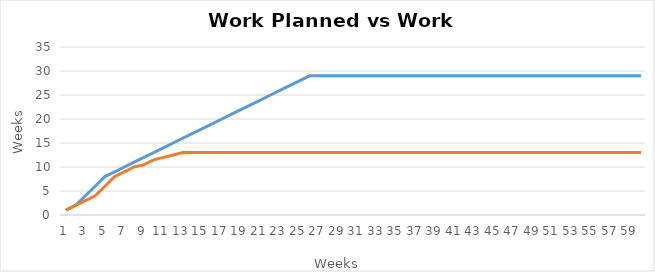
| Category | WP | WA |
|---|---|---|
| 0 | 1 | 1 |
| 1 | 2 | 2 |
| 2 | 4 | 3 |
| 3 | 6 | 4 |
| 4 | 8 | 6 |
| 5 | 9 | 8 |
| 6 | 10 | 9 |
| 7 | 11 | 10 |
| 8 | 12 | 10.5 |
| 9 | 13 | 11.5 |
| 10 | 14 | 12 |
| 11 | 15 | 12.5 |
| 12 | 16 | 13 |
| 13 | 17 | 13 |
| 14 | 18 | 13 |
| 15 | 19 | 13 |
| 16 | 20 | 13 |
| 17 | 21 | 13 |
| 18 | 22 | 13 |
| 19 | 23 | 13 |
| 20 | 24 | 13 |
| 21 | 25 | 13 |
| 22 | 26 | 13 |
| 23 | 27 | 13 |
| 24 | 28 | 13 |
| 25 | 29 | 13 |
| 26 | 29 | 13 |
| 27 | 29 | 13 |
| 28 | 29 | 13 |
| 29 | 29 | 13 |
| 30 | 29 | 13 |
| 31 | 29 | 13 |
| 32 | 29 | 13 |
| 33 | 29 | 13 |
| 34 | 29 | 13 |
| 35 | 29 | 13 |
| 36 | 29 | 13 |
| 37 | 29 | 13 |
| 38 | 29 | 13 |
| 39 | 29 | 13 |
| 40 | 29 | 13 |
| 41 | 29 | 13 |
| 42 | 29 | 13 |
| 43 | 29 | 13 |
| 44 | 29 | 13 |
| 45 | 29 | 13 |
| 46 | 29 | 13 |
| 47 | 29 | 13 |
| 48 | 29 | 13 |
| 49 | 29 | 13 |
| 50 | 29 | 13 |
| 51 | 29 | 13 |
| 52 | 29 | 13 |
| 53 | 29 | 13 |
| 54 | 29 | 13 |
| 55 | 29 | 13 |
| 56 | 29 | 13 |
| 57 | 29 | 13 |
| 58 | 29 | 13 |
| 59 | 29 | 13 |